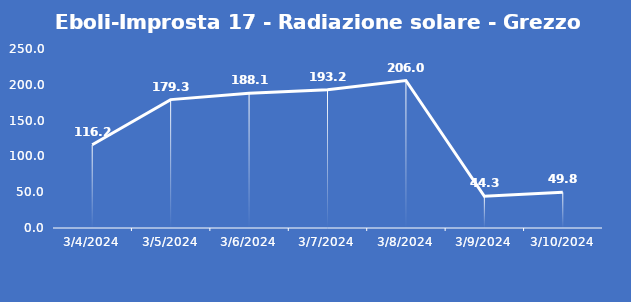
| Category | Eboli-Improsta 17 - Radiazione solare - Grezzo (W/m2) |
|---|---|
| 3/4/24 | 116.2 |
| 3/5/24 | 179.3 |
| 3/6/24 | 188.1 |
| 3/7/24 | 193.2 |
| 3/8/24 | 206 |
| 3/9/24 | 44.3 |
| 3/10/24 | 49.8 |